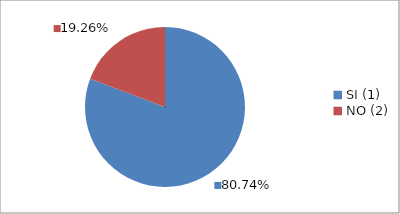
| Category | Series 0 |
|---|---|
| SI (1) | 0.807 |
| NO (2) | 0.193 |